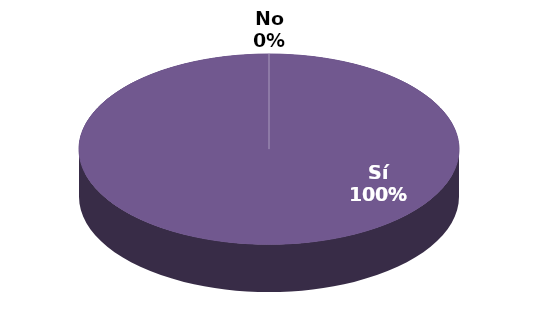
| Category | Series 1 |
|---|---|
| Sí | 11 |
| No | 0 |